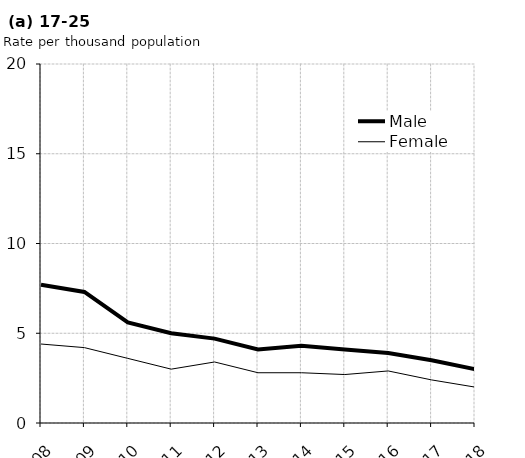
| Category | Male | Female |
|---|---|---|
| 2008.0 | 7.7 | 4.4 |
| 2009.0 | 7.3 | 4.2 |
| 2010.0 | 5.6 | 3.6 |
| 2011.0 | 5 | 3 |
| 2012.0 | 4.7 | 3.4 |
| 2013.0 | 4.1 | 2.8 |
| 2014.0 | 4.3 | 2.8 |
| 2015.0 | 4.1 | 2.7 |
| 2016.0 | 3.9 | 2.9 |
| 2017.0 | 3.5 | 2.4 |
| 2018.0 | 3 | 2 |